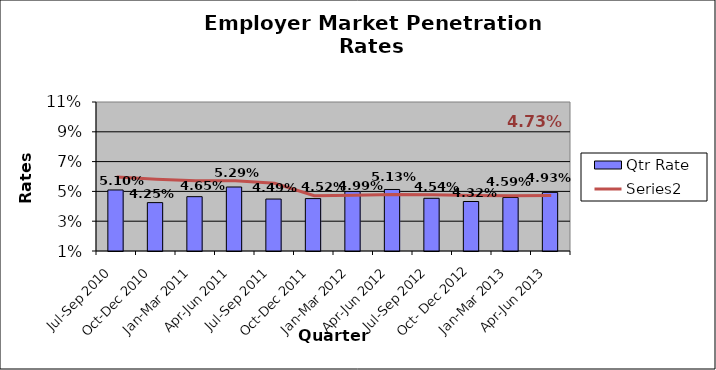
| Category | Qtr Rate |
|---|---|
| Jul-Sep 2010 | 0.051 |
| Oct-Dec 2010 | 0.042 |
| Jan-Mar 2011 | 0.046 |
| Apr-Jun 2011 | 0.053 |
| Jul-Sep 2011 | 0.045 |
| Oct-Dec 2011 | 0.045 |
| Jan-Mar 2012 | 0.05 |
| Apr-Jun 2012 | 0.051 |
| Jul-Sep 2012 | 0.045 |
| Oct- Dec 2012 | 0.043 |
| Jan-Mar 2013 | 0.046 |
| Apr-Jun 2013 | 0.049 |